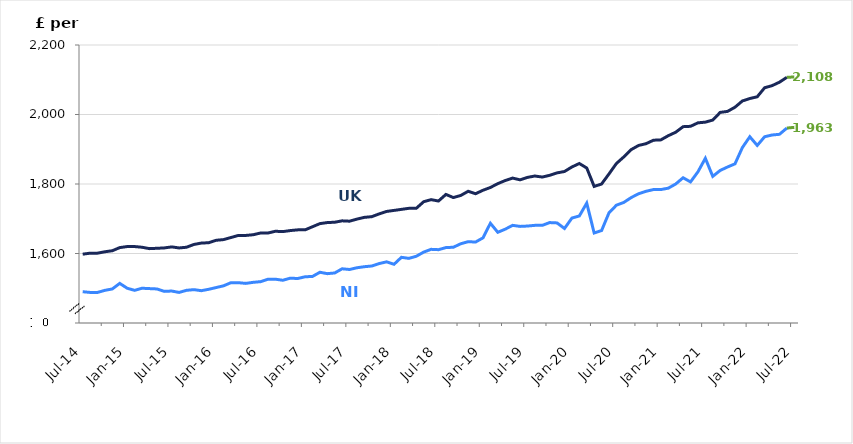
| Category | Series 0 | Series 1 |
|---|---|---|
| 2014-07-01 | 1490 | 1598 |
| 2014-08-01 | 1488 | 1601 |
| 2014-09-01 | 1488 | 1601 |
| 2014-10-01 | 1494 | 1605 |
| 2014-11-01 | 1498 | 1608 |
| 2014-12-01 | 1514 | 1617 |
| 2015-01-01 | 1500 | 1620 |
| 2015-02-01 | 1494 | 1620 |
| 2015-03-01 | 1500 | 1618 |
| 2015-04-01 | 1499 | 1614 |
| 2015-05-01 | 1498 | 1615 |
| 2015-06-01 | 1491 | 1616 |
| 2015-07-01 | 1492 | 1619 |
| 2015-08-01 | 1488 | 1616 |
| 2015-09-01 | 1494 | 1618 |
| 2015-10-01 | 1496 | 1626 |
| 2015-11-01 | 1493 | 1630 |
| 2015-12-01 | 1497 | 1631 |
| 2016-01-01 | 1502 | 1638 |
| 2016-02-01 | 1507 | 1640 |
| 2016-03-01 | 1516 | 1646 |
| 2016-04-01 | 1516 | 1652 |
| 2016-05-01 | 1514 | 1652 |
| 2016-06-01 | 1517 | 1654 |
| 2016-07-01 | 1519 | 1659 |
| 2016-08-01 | 1526 | 1659 |
| 2016-09-01 | 1526 | 1664 |
| 2016-10-01 | 1523 | 1663 |
| 2016-11-01 | 1529 | 1666 |
| 2016-12-01 | 1528 | 1668 |
| 2017-01-01 | 1533 | 1668 |
| 2017-02-01 | 1534 | 1677 |
| 2017-03-01 | 1546 | 1686 |
| 2017-04-01 | 1542 | 1689 |
| 2017-05-01 | 1544 | 1690 |
| 2017-06-01 | 1556 | 1694 |
| 2017-07-01 | 1554 | 1693 |
| 2017-08-01 | 1559 | 1699 |
| 2017-09-01 | 1562 | 1704 |
| 2017-10-01 | 1564 | 1706 |
| 2017-11-01 | 1571 | 1714 |
| 2017-12-01 | 1576 | 1721 |
| 2018-01-01 | 1569 | 1724 |
| 2018-02-01 | 1589 | 1727 |
| 2018-03-01 | 1586 | 1730 |
| 2018-04-01 | 1592 | 1730 |
| 2018-05-01 | 1604 | 1749 |
| 2018-06-01 | 1612 | 1755 |
| 2018-07-01 | 1611 | 1751 |
| 2018-08-01 | 1617 | 1770 |
| 2018-09-01 | 1618 | 1761 |
| 2018-10-01 | 1628 | 1767 |
| 2018-11-01 | 1634 | 1779 |
| 2018-12-01 | 1633 | 1772 |
| 2019-01-01 | 1645 | 1782 |
| 2019-02-01 | 1687 | 1790 |
| 2019-03-01 | 1661 | 1801 |
| 2019-04-01 | 1670 | 1810 |
| 2019-05-01 | 1681 | 1817 |
| 2019-06-01 | 1678 | 1812 |
| 2019-07-01 | 1679 | 1819 |
| 2019-08-01 | 1681 | 1823 |
| 2019-09-01 | 1681 | 1820 |
| 2019-10-01 | 1689 | 1825 |
| 2019-11-01 | 1688 | 1832 |
| 2019-12-01 | 1672 | 1836 |
| 2020-01-01 | 1702 | 1849 |
| 2020-02-01 | 1708 | 1859 |
| 2020-03-01 | 1745 | 1846 |
| 2020-04-01 | 1659 | 1793 |
| 2020-05-01 | 1666 | 1800 |
| 2020-06-01 | 1717 | 1829 |
| 2020-07-01 | 1739 | 1859 |
| 2020-08-01 | 1747 | 1878 |
| 2020-09-01 | 1761 | 1899 |
| 2020-10-01 | 1772 | 1911 |
| 2020-11-01 | 1779 | 1916 |
| 2020-12-01 | 1784 | 1926 |
| 2021-01-01 | 1784 | 1927 |
| 2021-02-01 | 1788 | 1939 |
| 2021-03-01 | 1800 | 1949 |
| 2021-04-01 | 1818 | 1965 |
| 2021-05-01 | 1806 | 1966 |
| 2021-06-01 | 1835 | 1976 |
| 2021-07-01 | 1874 | 1978 |
| 2021-08-01 | 1822 | 1984 |
| 2021-09-01 | 1839 | 2006 |
| 2021-10-01 | 1849 | 2009 |
| 2021-11-01 | 1858 | 2021 |
| 2021-12-01 | 1905 | 2039 |
| 2022-01-01 | 1936 | 2046 |
| 2022-02-01 | 1911 | 2051 |
| 2022-03-01 | 1936 | 2077 |
| 2022-04-01 | 1941 | 2083 |
| 2022-05-01 | 1943 | 2093 |
| 2022-06-01 | 1961 | 2107 |
| 2022-07-01 | 1963 | 2108 |